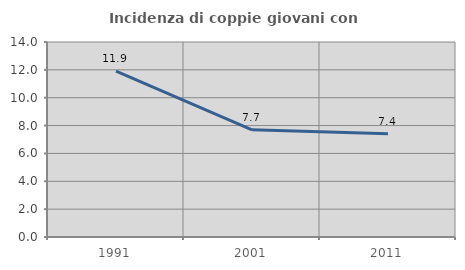
| Category | Incidenza di coppie giovani con figli |
|---|---|
| 1991.0 | 11.905 |
| 2001.0 | 7.692 |
| 2011.0 | 7.407 |